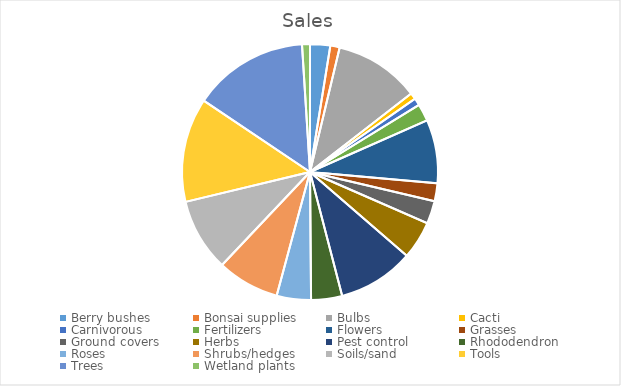
| Category | Sales |
|---|---|
| Berry bushes | 376.5 |
| Bonsai supplies | 175.4 |
| Bulbs | 1595.09 |
| Cacti | 119 |
| Carnivorous | 134.3 |
| Fertilizers | 321.65 |
| Flowers | 1188.25 |
| Grasses | 335.9 |
| Ground covers | 426.55 |
| Herbs | 709.05 |
| Pest control | 1422.13 |
| Rhododendron | 579.02 |
| Roses | 639.86 |
| Shrubs/hedges | 1164.9 |
| Soils/sand | 1361.4 |
| Tools | 1949.22 |
| Trees | 2159.24 |
| Wetland plants | 148 |